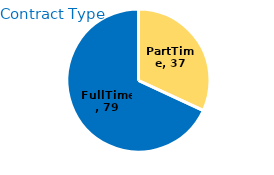
| Category | Total |
|---|---|
| PartTime | 37 |
| FullTime | 79 |